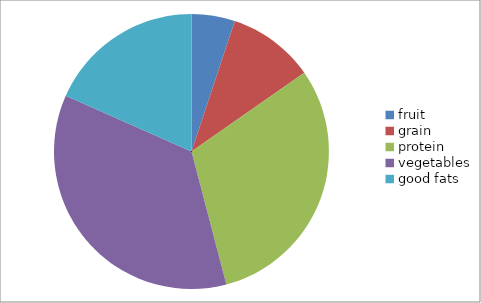
| Category | Series 0 |
|---|---|
| fruit | 5 |
| grain | 10 |
| protein | 30 |
| vegetables | 35 |
| good fats | 18 |